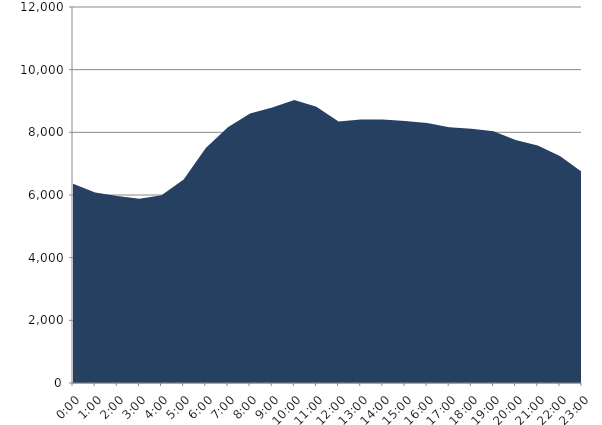
| Category | Series 0 | Series 1 |
|---|---|---|
| 2023-07-19 |  | 6359.163 |
| 2023-07-19 01:00:00 |  | 6080.938 |
| 2023-07-19 02:00:00 |  | 5965.948 |
| 2023-07-19 03:00:00 |  | 5879.341 |
| 2023-07-19 04:00:00 |  | 5995.329 |
| 2023-07-19 05:00:00 |  | 6494.551 |
| 2023-07-19 06:00:00 |  | 7500.388 |
| 2023-07-19 07:00:00 |  | 8165.575 |
| 2023-07-19 08:00:00 |  | 8603.116 |
| 2023-07-19 09:00:00 |  | 8790.908 |
| 2023-07-19 10:00:00 |  | 9033.395 |
| 2023-07-19 11:00:00 |  | 8813.168 |
| 2023-07-19 12:00:00 |  | 8345.205 |
| 2023-07-19 13:00:00 |  | 8408.148 |
| 2023-07-19 14:00:00 |  | 8407.473 |
| 2023-07-19 15:00:00 |  | 8358.439 |
| 2023-07-19 16:00:00 |  | 8295.656 |
| 2023-07-19 17:00:00 |  | 8166.125 |
| 2023-07-19 18:00:00 |  | 8114.197 |
| 2023-07-19 19:00:00 |  | 8036.436 |
| 2023-07-19 20:00:00 |  | 7754.762 |
| 2023-07-19 21:00:00 |  | 7583.431 |
| 2023-07-19 22:00:00 |  | 7245.77 |
| 2023-07-19 23:00:00 |  | 6731.782 |